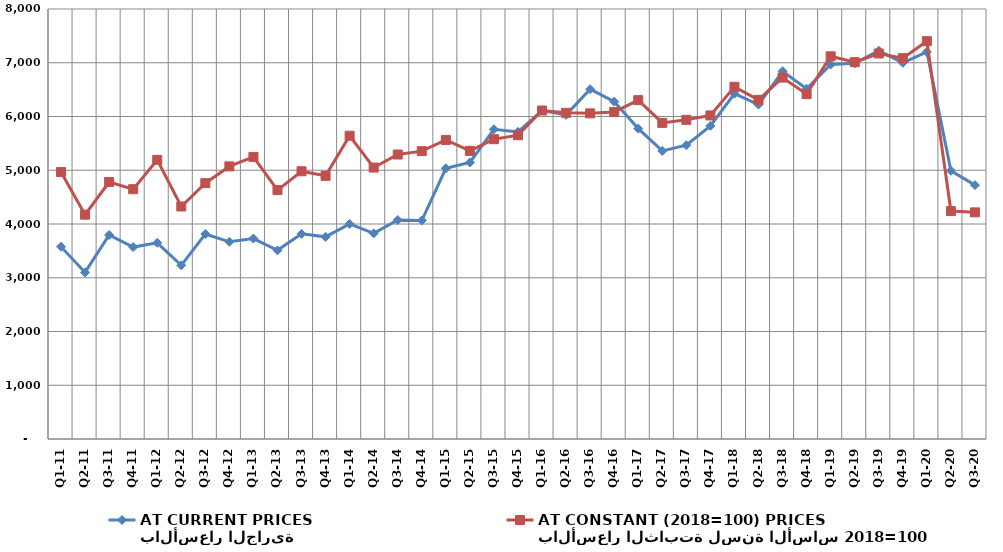
| Category | بالأسعار الجارية
AT CURRENT PRICES | بالأسعار الثابتة لسنة الأساس 2018=100
AT CONSTANT (2018=100) PRICES |
|---|---|---|
| Q1-11 | 3577.176 | 4966.786 |
| Q2-11 | 3099.181 | 4174.057 |
| Q3-11 | 3795.946 | 4781.609 |
| Q4-11 | 3570.78 | 4647.552 |
| Q1-12 | 3650.541 | 5193.59 |
| Q2-12 | 3231.43 | 4326.072 |
| Q3-12 | 3814.141 | 4759.776 |
| Q4-12 | 3668.662 | 5071.597 |
| Q1-13 | 3729.369 | 5248.241 |
| Q2-13 | 3509.762 | 4631.242 |
| Q3-13 | 3816.997 | 4980.84 |
| Q4-13 | 3760.917 | 4895.936 |
| Q1-14 | 4001.961 | 5642.242 |
| Q2-14 | 3826.157 | 5050.212 |
| Q3-14 | 4074.169 | 5292.932 |
| Q4-14 | 4064.622 | 5355.526 |
| Q1-15 | 5035.433 | 5563.808 |
| Q2-15 | 5145.434 | 5360.638 |
| Q3-15 | 5761.923 | 5577.79 |
| Q4-15 | 5713.787 | 5652.547 |
| Q1-16 | 6111.404 | 6111.53 |
| Q2-16 | 6030.06 | 6068.124 |
| Q3-16 | 6508.387 | 6058.245 |
| Q4-16 | 6277.366 | 6082.493 |
| Q1-17 | 5775.14 | 6304.511 |
| Q2-17 | 5359.236 | 5881.398 |
| Q3-17 | 5465.453 | 5937.813 |
| Q4-17 | 5825.981 | 6019.576 |
| Q1-18 | 6424.008 | 6552.111 |
| Q2-18 | 6221.551 | 6309.918 |
| Q3-18 | 6840.818 | 6723.876 |
| Q4-18 | 6515.65 | 6416.122 |
| Q1-19 | 6966.335 | 7119.765 |
| Q2-19 | 6989.879 | 7010.859 |
| Q3-19 | 7224.007 | 7172.643 |
| Q4-19 | 6998.867 | 7085.098 |
| Q1-20 | 7201.994 | 7401.083 |
| Q2-20 | 4990.568 | 4240.657 |
| Q3-20 | 4723.706 | 4216.52 |